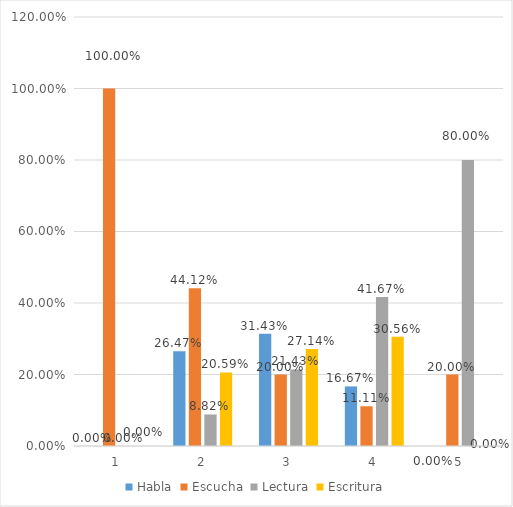
| Category | Habla | Escucha | Lectura | Escritura |
|---|---|---|---|---|
| 0 | 0 | 1 | 0 | 0 |
| 1 | 0.265 | 0.441 | 0.088 | 0.206 |
| 2 | 0.314 | 0.2 | 0.214 | 0.271 |
| 3 | 0.167 | 0.111 | 0.417 | 0.306 |
| 4 | 0 | 0.2 | 0.8 | 0 |